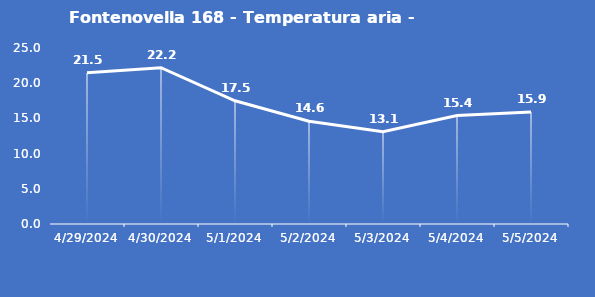
| Category | Fontenovella 168 - Temperatura aria - Grezzo (°C) |
|---|---|
| 4/29/24 | 21.5 |
| 4/30/24 | 22.2 |
| 5/1/24 | 17.5 |
| 5/2/24 | 14.6 |
| 5/3/24 | 13.1 |
| 5/4/24 | 15.4 |
| 5/5/24 | 15.9 |